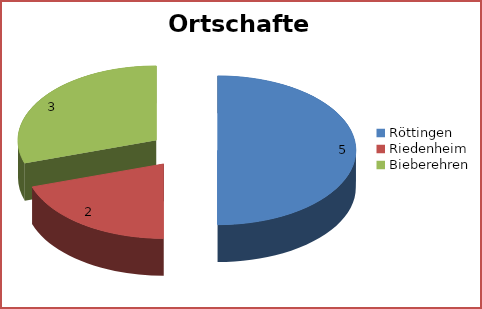
| Category | Series 0 |
|---|---|
| Röttingen | 5 |
| Riedenheim | 2 |
| Bieberehren | 3 |